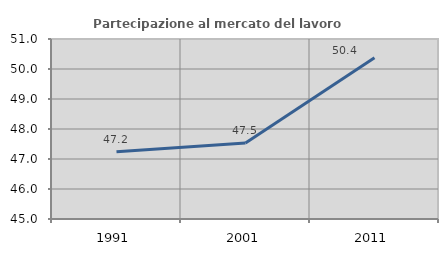
| Category | Partecipazione al mercato del lavoro  femminile |
|---|---|
| 1991.0 | 47.241 |
| 2001.0 | 47.537 |
| 2011.0 | 50.374 |